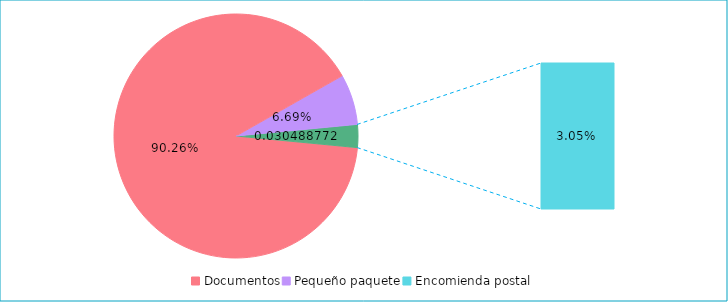
| Category | Series 0 |
|---|---|
| Documentos | 0.903 |
| Pequeño paquete | 0.067 |
| Encomienda postal | 0.03 |